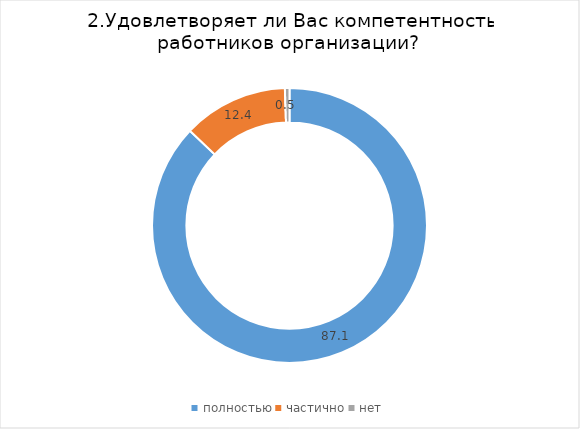
| Category | Series 0 |
|---|---|
| полностью | 87.097 |
| частично | 12.364 |
| нет | 0.539 |